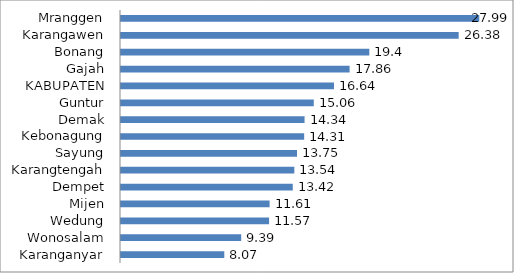
| Category | Series 0 |
|---|---|
| Karanganyar | 8.07 |
| Wonosalam | 9.39 |
| Wedung | 11.57 |
| Mijen | 11.61 |
| Dempet | 13.42 |
| Karangtengah | 13.54 |
| Sayung | 13.75 |
| Kebonagung | 14.31 |
| Demak | 14.34 |
| Guntur | 15.06 |
| KABUPATEN | 16.64 |
| Gajah | 17.86 |
| Bonang | 19.4 |
| Karangawen | 26.38 |
| Mranggen | 27.99 |